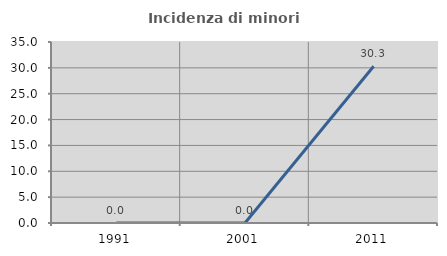
| Category | Incidenza di minori stranieri |
|---|---|
| 1991.0 | 0 |
| 2001.0 | 0 |
| 2011.0 | 30.303 |